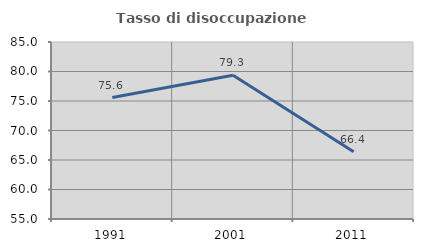
| Category | Tasso di disoccupazione giovanile  |
|---|---|
| 1991.0 | 75.588 |
| 2001.0 | 79.349 |
| 2011.0 | 66.4 |